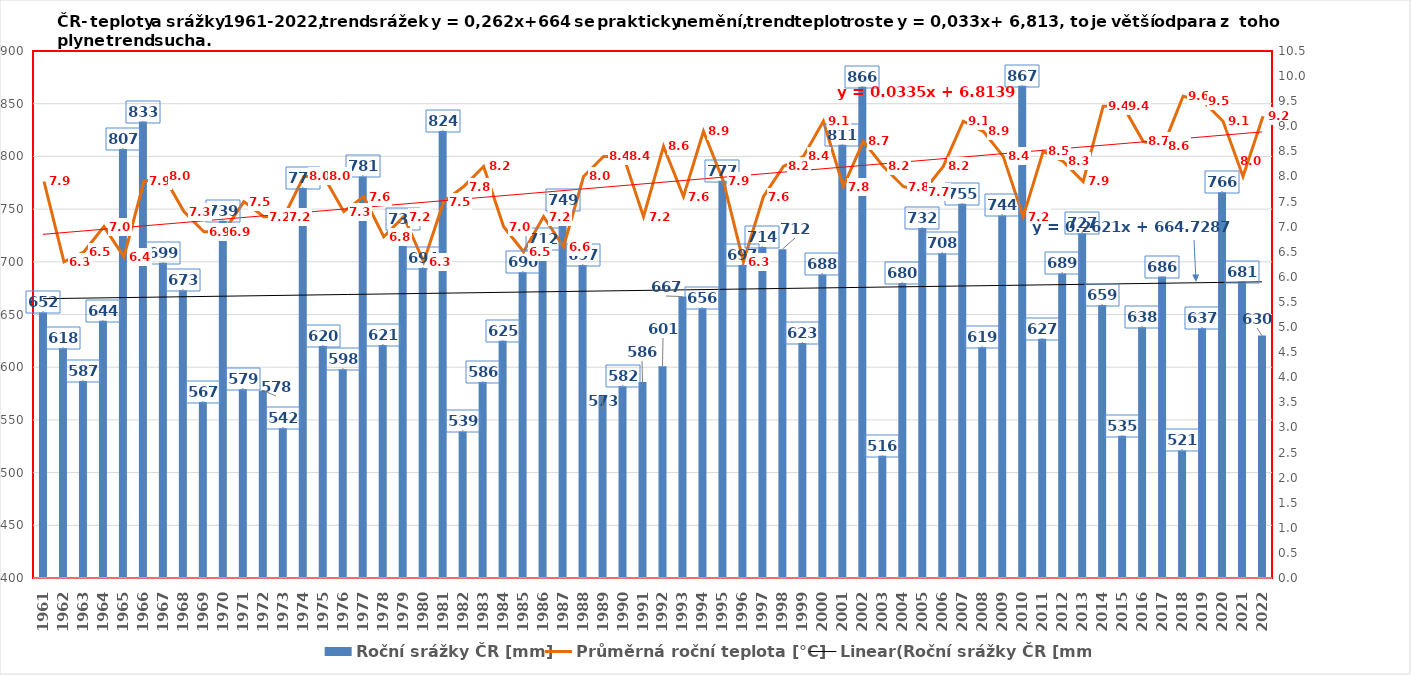
| Category | Roční srážky ČR [mm] |
|---|---|
| 1961.0 | 652 |
| 1962.0 | 618 |
| 1963.0 | 587 |
| 1964.0 | 644 |
| 1965.0 | 807 |
| 1966.0 | 833 |
| 1967.0 | 699 |
| 1968.0 | 673 |
| 1969.0 | 567 |
| 1970.0 | 739 |
| 1971.0 | 579 |
| 1972.0 | 578 |
| 1973.0 | 542 |
| 1974.0 | 770 |
| 1975.0 | 620 |
| 1976.0 | 598 |
| 1977.0 | 781 |
| 1978.0 | 621 |
| 1979.0 | 731 |
| 1980.0 | 694 |
| 1981.0 | 824 |
| 1982.0 | 539 |
| 1983.0 | 586 |
| 1984.0 | 625 |
| 1985.0 | 690 |
| 1986.0 | 712 |
| 1987.0 | 749 |
| 1988.0 | 697 |
| 1989.0 | 573 |
| 1990.0 | 582 |
| 1991.0 | 586 |
| 1992.0 | 601 |
| 1993.0 | 667 |
| 1994.0 | 656 |
| 1995.0 | 777 |
| 1996.0 | 697 |
| 1997.0 | 714 |
| 1998.0 | 712 |
| 1999.0 | 623 |
| 2000.0 | 688 |
| 2001.0 | 811 |
| 2002.0 | 866 |
| 2003.0 | 516 |
| 2004.0 | 680 |
| 2005.0 | 732 |
| 2006.0 | 708 |
| 2007.0 | 755 |
| 2008.0 | 619 |
| 2009.0 | 744 |
| 2010.0 | 867 |
| 2011.0 | 627 |
| 2012.0 | 689 |
| 2013.0 | 727 |
| 2014.0 | 659 |
| 2015.0 | 535 |
| 2016.0 | 638 |
| 2017.0 | 686 |
| 2018.0 | 521 |
| 2019.0 | 637 |
| 2020.0 | 766 |
| 2021.0 | 681 |
| 2022.0 | 630 |